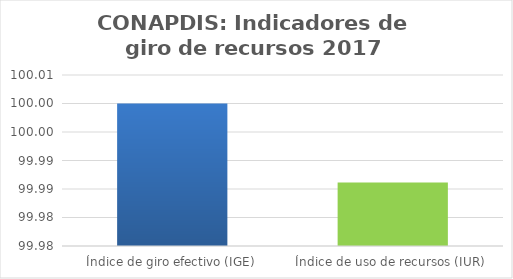
| Category | Series 0 |
|---|---|
| Índice de giro efectivo (IGE) | 100 |
| Índice de uso de recursos (IUR)  | 99.986 |